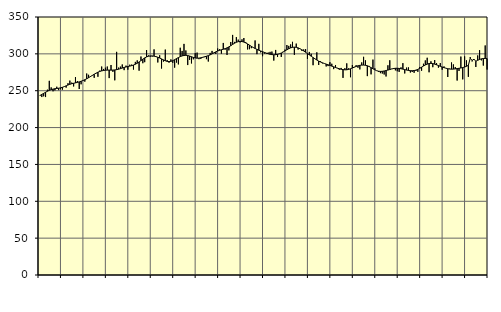
| Category | Piggar | Series 1 |
|---|---|---|
| nan | 243 | 243.45 |
| 1.0 | 241.4 | 245.01 |
| 1.0 | 242.4 | 246.41 |
| 1.0 | 241.4 | 247.89 |
| 1.0 | 251.4 | 249.29 |
| 1.0 | 263.4 | 250.54 |
| 1.0 | 254.5 | 251.51 |
| 1.0 | 249.2 | 252.19 |
| 1.0 | 250.5 | 252.71 |
| 1.0 | 255.4 | 253.04 |
| 1.0 | 250.8 | 253.38 |
| 1.0 | 252 | 253.89 |
| nan | 251.4 | 254.61 |
| 2.0 | 255.7 | 255.55 |
| 2.0 | 254.2 | 256.64 |
| 2.0 | 260.2 | 257.73 |
| 2.0 | 263.7 | 258.7 |
| 2.0 | 261 | 259.47 |
| 2.0 | 255.8 | 260.08 |
| 2.0 | 268.5 | 260.65 |
| 2.0 | 263.1 | 261.28 |
| 2.0 | 252.3 | 262.01 |
| 2.0 | 258.7 | 262.83 |
| 2.0 | 264.2 | 263.81 |
| nan | 262.3 | 264.94 |
| 3.0 | 273.3 | 266.22 |
| 3.0 | 271.6 | 267.67 |
| 3.0 | 269.9 | 269.21 |
| 3.0 | 270.4 | 270.76 |
| 3.0 | 267.5 | 272.34 |
| 3.0 | 273.4 | 273.83 |
| 3.0 | 268.9 | 275.12 |
| 3.0 | 277.3 | 276.14 |
| 3.0 | 282.8 | 276.89 |
| 3.0 | 279.5 | 277.44 |
| 3.0 | 281.2 | 277.77 |
| nan | 282.8 | 277.94 |
| 4.0 | 267.1 | 277.98 |
| 4.0 | 284.9 | 277.94 |
| 4.0 | 275.6 | 277.99 |
| 4.0 | 264.1 | 278.19 |
| 4.0 | 302.7 | 278.58 |
| 4.0 | 281.3 | 279.18 |
| 4.0 | 282.7 | 279.92 |
| 4.0 | 285.6 | 280.74 |
| 4.0 | 277.9 | 281.54 |
| 4.0 | 284 | 282.23 |
| 4.0 | 278.5 | 282.81 |
| nan | 285.3 | 283.35 |
| 5.0 | 285.4 | 284 |
| 5.0 | 278.7 | 284.82 |
| 5.0 | 289.1 | 285.88 |
| 5.0 | 291.2 | 287.28 |
| 5.0 | 277.2 | 288.98 |
| 5.0 | 296.4 | 290.85 |
| 5.0 | 287.3 | 292.78 |
| 5.0 | 288.7 | 294.49 |
| 5.0 | 305.1 | 295.85 |
| 5.0 | 297.9 | 296.79 |
| 5.0 | 296.2 | 297.24 |
| nan | 296.3 | 297.24 |
| 6.0 | 306.1 | 296.87 |
| 6.0 | 296.9 | 296.23 |
| 6.0 | 288.3 | 295.4 |
| 6.0 | 298.1 | 294.35 |
| 6.0 | 280.1 | 293.14 |
| 6.0 | 289.5 | 291.85 |
| 6.0 | 305.8 | 290.63 |
| 6.0 | 291.4 | 289.8 |
| 6.0 | 288 | 289.51 |
| 6.0 | 292.5 | 289.84 |
| 6.0 | 287.8 | 290.78 |
| nan | 281.3 | 292.11 |
| 7.0 | 288.2 | 293.57 |
| 7.0 | 285.7 | 294.97 |
| 7.0 | 308.3 | 296.22 |
| 7.0 | 304 | 297.22 |
| 7.0 | 313.5 | 297.83 |
| 7.0 | 304.6 | 298.02 |
| 7.0 | 284.8 | 297.72 |
| 7.0 | 291.7 | 297.02 |
| 7.0 | 287 | 296.1 |
| 7.0 | 292.6 | 295.17 |
| 7.0 | 301 | 294.46 |
| nan | 301.7 | 294.12 |
| 8.0 | 292.8 | 294.22 |
| 8.0 | 293.2 | 294.69 |
| 8.0 | 294.8 | 295.35 |
| 8.0 | 295.6 | 296.05 |
| 8.0 | 292.8 | 296.78 |
| 8.0 | 289.6 | 297.6 |
| 8.0 | 301.3 | 298.64 |
| 8.0 | 304 | 299.94 |
| 8.0 | 300.8 | 301.36 |
| 8.0 | 299.8 | 302.72 |
| 8.0 | 307.3 | 303.86 |
| nan | 306.2 | 304.77 |
| 9.0 | 300.3 | 305.53 |
| 9.0 | 314.8 | 306.27 |
| 9.0 | 305.7 | 307.08 |
| 9.0 | 298.5 | 308.11 |
| 9.0 | 304.7 | 309.45 |
| 9.0 | 316.1 | 311.05 |
| 9.0 | 325.7 | 312.79 |
| 9.0 | 316.2 | 314.39 |
| 9.0 | 322.7 | 315.7 |
| 9.0 | 319.3 | 316.57 |
| 9.0 | 315.5 | 316.91 |
| nan | 319.7 | 316.7 |
| 10.0 | 321.5 | 316 |
| 10.0 | 316.1 | 314.89 |
| 10.0 | 306 | 313.44 |
| 10.0 | 306.3 | 311.83 |
| 10.0 | 307.7 | 310.18 |
| 10.0 | 308.4 | 308.66 |
| 10.0 | 318.2 | 307.3 |
| 10.0 | 299.6 | 306.09 |
| 10.0 | 313.6 | 304.97 |
| 10.0 | 302 | 303.91 |
| 10.0 | 296.8 | 302.91 |
| nan | 300.4 | 301.94 |
| 11.0 | 300.1 | 301 |
| 11.0 | 301.8 | 300.15 |
| 11.0 | 302.7 | 299.45 |
| 11.0 | 303.1 | 298.96 |
| 11.0 | 290.9 | 298.78 |
| 11.0 | 305.3 | 298.89 |
| 11.0 | 295.7 | 299.32 |
| 11.0 | 300.3 | 300.07 |
| 11.0 | 295.8 | 301.15 |
| 11.0 | 302.9 | 302.48 |
| 11.0 | 305.8 | 303.97 |
| nan | 312 | 305.54 |
| 12.0 | 310.8 | 306.98 |
| 12.0 | 312.8 | 308.11 |
| 12.0 | 316.3 | 308.85 |
| 12.0 | 298.6 | 309.12 |
| 12.0 | 313.9 | 308.87 |
| 12.0 | 305.8 | 308.15 |
| 12.0 | 307.2 | 306.99 |
| 12.0 | 304.1 | 305.53 |
| 12.0 | 306 | 303.88 |
| 12.0 | 306.4 | 302.15 |
| 12.0 | 293.1 | 300.38 |
| nan | 302.6 | 298.59 |
| 13.0 | 300.1 | 296.8 |
| 13.0 | 284.6 | 295 |
| 13.0 | 293.4 | 293.25 |
| 13.0 | 302.1 | 291.63 |
| 13.0 | 284.9 | 290.2 |
| 13.0 | 289.9 | 288.93 |
| 13.0 | 287.1 | 287.88 |
| 13.0 | 286.8 | 286.97 |
| 13.0 | 282.9 | 286.1 |
| 13.0 | 283.4 | 285.18 |
| 13.0 | 288.7 | 284.27 |
| nan | 286.6 | 283.37 |
| 14.0 | 279.3 | 282.42 |
| 14.0 | 284.9 | 281.48 |
| 14.0 | 280.9 | 280.59 |
| 14.0 | 278.5 | 279.78 |
| 14.0 | 280.9 | 279.1 |
| 14.0 | 267.4 | 278.61 |
| 14.0 | 280.6 | 278.32 |
| 14.0 | 287.1 | 278.4 |
| 14.0 | 280.4 | 278.87 |
| 14.0 | 268.3 | 279.74 |
| 14.0 | 284.8 | 280.81 |
| nan | 282.3 | 281.91 |
| 15.0 | 284.6 | 282.93 |
| 15.0 | 281.2 | 283.8 |
| 15.0 | 278.9 | 284.41 |
| 15.0 | 288.4 | 284.75 |
| 15.0 | 296 | 284.79 |
| 15.0 | 291.2 | 284.52 |
| 15.0 | 269.8 | 283.88 |
| 15.0 | 283.6 | 282.77 |
| 15.0 | 272.2 | 281.31 |
| 15.0 | 292.2 | 279.75 |
| 15.0 | 280.4 | 278.32 |
| nan | 277.1 | 277.16 |
| 16.0 | 275.4 | 276.44 |
| 16.0 | 273.8 | 276.19 |
| 16.0 | 273.3 | 276.33 |
| 16.0 | 272 | 276.78 |
| 16.0 | 269.3 | 277.38 |
| 16.0 | 284.5 | 278.03 |
| 16.0 | 291.3 | 278.74 |
| 16.0 | 279.7 | 279.46 |
| 16.0 | 280.8 | 280.06 |
| 16.0 | 277.6 | 280.42 |
| 16.0 | 276.4 | 280.47 |
| nan | 275.5 | 280.24 |
| 17.0 | 281.7 | 279.82 |
| 17.0 | 287.4 | 279.27 |
| 17.0 | 273.4 | 278.64 |
| 17.0 | 281.4 | 278 |
| 17.0 | 281.6 | 277.5 |
| 17.0 | 274.7 | 277.2 |
| 17.0 | 275.4 | 277.13 |
| 17.0 | 274.3 | 277.36 |
| 17.0 | 276.9 | 277.97 |
| 17.0 | 275.6 | 278.99 |
| 17.0 | 282.2 | 280.34 |
| nan | 277.1 | 281.9 |
| 18.0 | 286.6 | 283.49 |
| 18.0 | 291.1 | 284.91 |
| 18.0 | 294.7 | 286.05 |
| 18.0 | 275 | 286.83 |
| 18.0 | 289.9 | 287.09 |
| 18.0 | 281.9 | 286.8 |
| 18.0 | 291.6 | 286.07 |
| 18.0 | 287.4 | 285.13 |
| 18.0 | 281.3 | 284.13 |
| 18.0 | 287.5 | 283.1 |
| 18.0 | 278.5 | 282.18 |
| nan | 282.9 | 281.32 |
| 19.0 | 280.5 | 280.51 |
| 19.0 | 268.6 | 279.86 |
| 19.0 | 279.9 | 279.41 |
| 19.0 | 288.3 | 279.22 |
| 19.0 | 285.7 | 279.31 |
| 19.0 | 282.1 | 279.61 |
| 19.0 | 263.8 | 280.01 |
| 19.0 | 276.8 | 280.4 |
| 19.0 | 296.3 | 280.83 |
| 19.0 | 265.4 | 281.41 |
| 19.0 | 296.6 | 282.12 |
| nan | 291.2 | 283.13 |
| 20.0 | 268.8 | 284.47 |
| 20.0 | 295.6 | 294.02 |
| 20.0 | 289.7 | 291.09 |
| 20.0 | 292.1 | 292.79 |
| 20.0 | 282.2 | 289.97 |
| 20.0 | 297.9 | 291.28 |
| 20.0 | 305 | 292.39 |
| 20.0 | 291.2 | 293.24 |
| 20.0 | 284.1 | 293.69 |
| 20.0 | 311.4 | 293.76 |
| 20.0 | 278.7 | 293.56 |